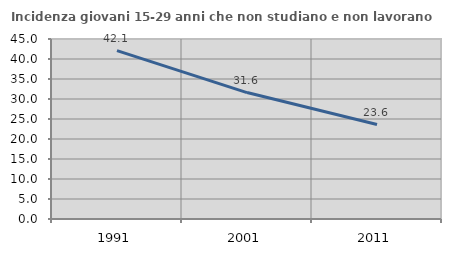
| Category | Incidenza giovani 15-29 anni che non studiano e non lavorano  |
|---|---|
| 1991.0 | 42.105 |
| 2001.0 | 31.607 |
| 2011.0 | 23.619 |